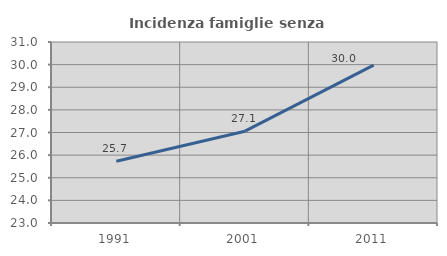
| Category | Incidenza famiglie senza nuclei |
|---|---|
| 1991.0 | 25.731 |
| 2001.0 | 27.059 |
| 2011.0 | 29.979 |